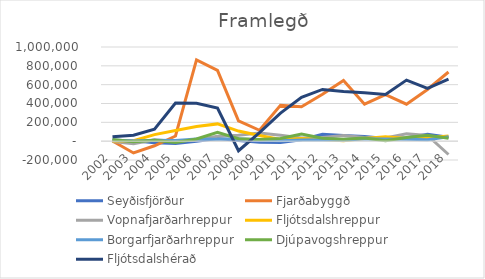
| Category | Seyðisfjörður | Fjarðabyggð | Vopnafjarðarhreppur | Fljótsdalshreppur | Borgarfjarðarhreppur | Djúpavogshreppur | Fljótsdalshérað |
|---|---|---|---|---|---|---|---|
| 2002.0 | 8494 | 2361 | -3259 | 1092 | 11641 | 17219 | 46735 |
| 2003.0 | 3156 | -125472 | -27231 | 5364 | 2820 | -5016 | 63848 |
| 2004.0 | -17778 | -49112 | 15124 | 69883 | 9481 | 8433 | 127295 |
| 2005.0 | -24512 | 54840 | -2484 | 113802 | 8067 | -14046 | 404402 |
| 2006.0 | -1430 | 863634 | 15623 | 155286 | 21797 | 22530 | 402295 |
| 2007.0 | 27118 | 751156 | 52607 | 183475 | 19693 | 94463 | 350505 |
| 2008.0 | 5835 | 216457 | 62403 | 107445 | 26530 | 25151 | -101562 |
| 2009.0 | -10223 | 115778 | 87476 | 60480 | 11299 | 18046 | 91264 |
| 2010.0 | -13408 | 379798 | 64056 | 17226 | 5503 | 28800 | 297617 |
| 2011.0 | 15993 | 365050 | 32496 | 28988 | 11145.832 | 74534.372 | 466103 |
| 2012.0 | 73171 | 498440 | 40110 | 18125 | 14596 | 31383 | 549175 |
| 2013.0 | 59271 | 645014 | 59005 | 4604 | 11018 | 20988 | 526657 |
| 2014.0 | 50803 | 392403 | 40252 | 27465 | 26107 | 34702 | 514056 |
| 2015.0 | 28867 | 494269 | 34242 | 47241 | 21907 | 4892 | 495500 |
| 2016.0 | 35451 | 392331 | 78391 | 28482 | 20286 | 39707 | 648771 |
| 2017.0 | 72382 | 548914 | 60652 | 35862 | 16281 | 62647 | 560313 |
| 2018.0 | 41194 | 734620 | -141465 | 56148 | 46589 | 31640 | 659608 |